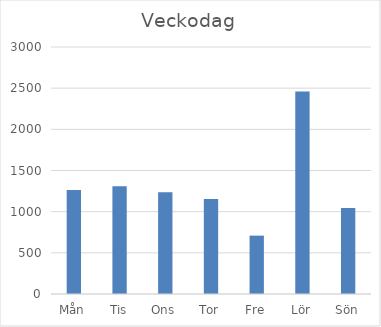
| Category | Summa |
|---|---|
| Mån | 1263 |
| Tis | 1310 |
| Ons | 1237 |
| Tor | 1154 |
| Fre | 709 |
| Lör | 2460 |
| Sön | 1044 |